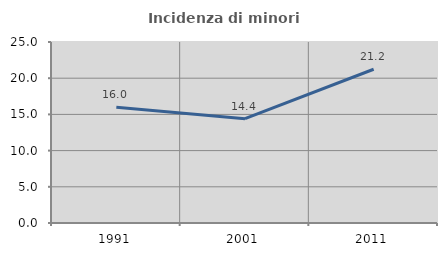
| Category | Incidenza di minori stranieri |
|---|---|
| 1991.0 | 16 |
| 2001.0 | 14.407 |
| 2011.0 | 21.239 |